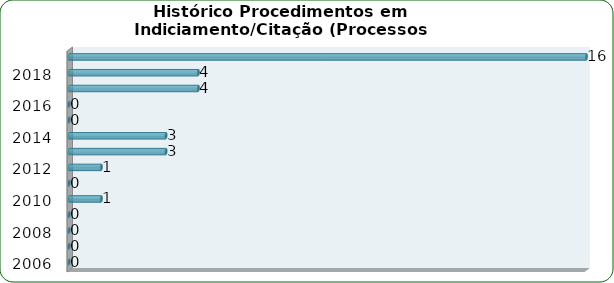
| Category | Total de Processos Administrativos Disciplinares |
|---|---|
| 2006 | 0 |
| 2007 | 0 |
| 2008 | 0 |
| 2009 | 0 |
| 2010 | 1 |
| 2011 | 0 |
| 2012 | 1 |
| 2013 | 3 |
| 2014 | 3 |
| 2015 | 0 |
| 2016 | 0 |
| 2017 | 4 |
| 2018 | 4 |
| Total | 16 |